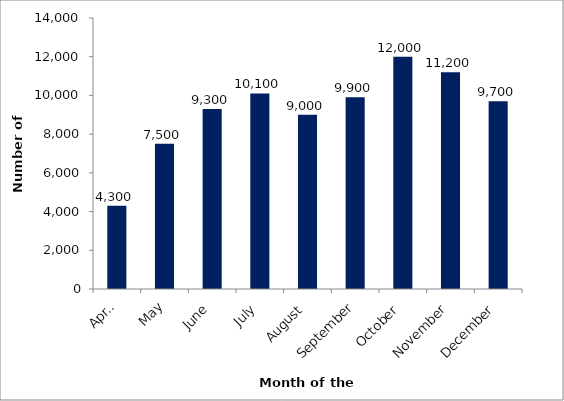
| Category | Number of applications  |
|---|---|
| April | 4300 |
| May | 7500 |
| June | 9300 |
| July | 10100 |
| August | 9000 |
| September | 9900 |
| October | 12000 |
| November | 11200 |
| December | 9700 |